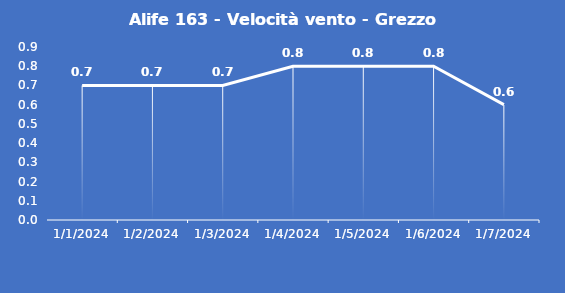
| Category | Alife 163 - Velocità vento - Grezzo (m/s) |
|---|---|
| 1/1/24 | 0.7 |
| 1/2/24 | 0.7 |
| 1/3/24 | 0.7 |
| 1/4/24 | 0.8 |
| 1/5/24 | 0.8 |
| 1/6/24 | 0.8 |
| 1/7/24 | 0.6 |